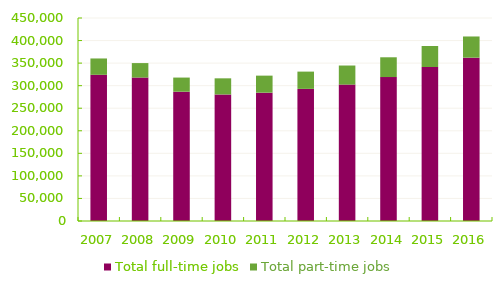
| Category | Total full-time jobs | Total part-time jobs |
|---|---|---|
| 2007.0 | 324105 | 36196 |
| 2008.0 | 317981 | 32080 |
| 2009.0 | 286630 | 31327 |
| 2010.0 | 280520 | 35738 |
| 2011.0 | 284454 | 37786 |
| 2012.0 | 292869 | 38299 |
| 2013.0 | 302401 | 42264 |
| 2014.0 | 319084 | 43830 |
| 2015.0 | 341412 | 46567 |
| 2016.0 | 362044 | 46997 |